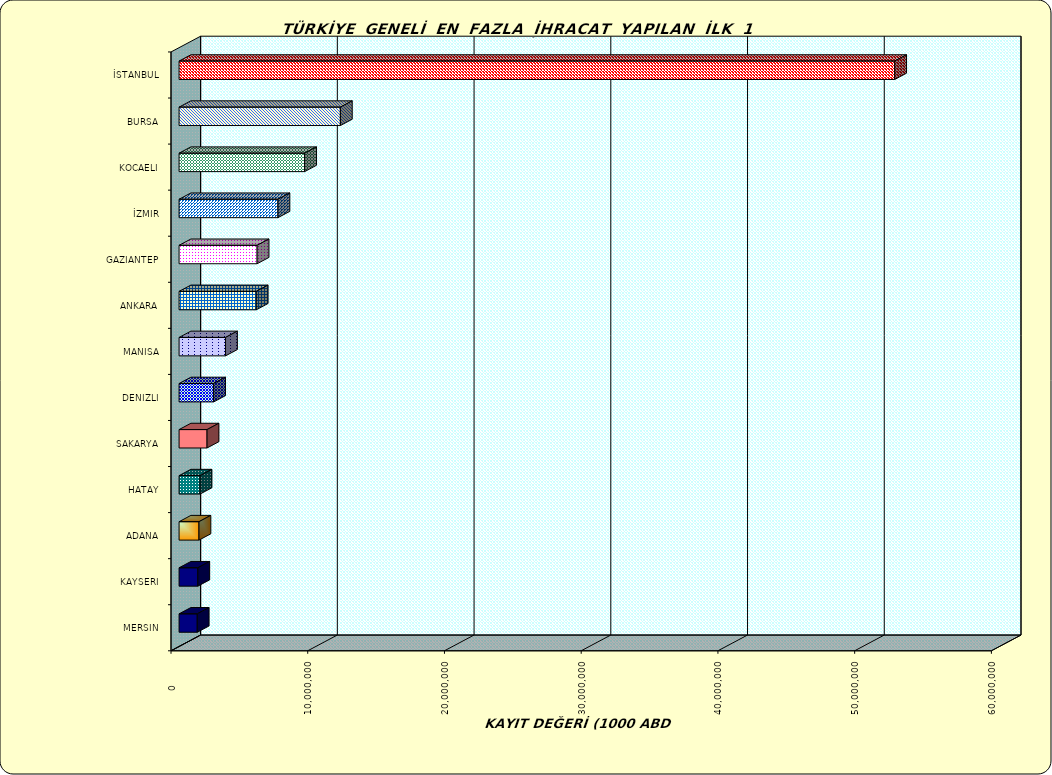
| Category | Series 0 |
|---|---|
| İSTANBUL | 52337391.375 |
| BURSA | 11797650.289 |
| KOCAELI | 9183095.521 |
| İZMIR | 7231487.187 |
| GAZIANTEP | 5707717.223 |
| ANKARA | 5643882.627 |
| MANISA | 3397872.688 |
| DENIZLI | 2527652.358 |
| SAKARYA | 2045559.839 |
| HATAY | 1533642.11 |
| ADANA | 1455826.815 |
| KAYSERI | 1371038.016 |
| MERSIN | 1329451.596 |